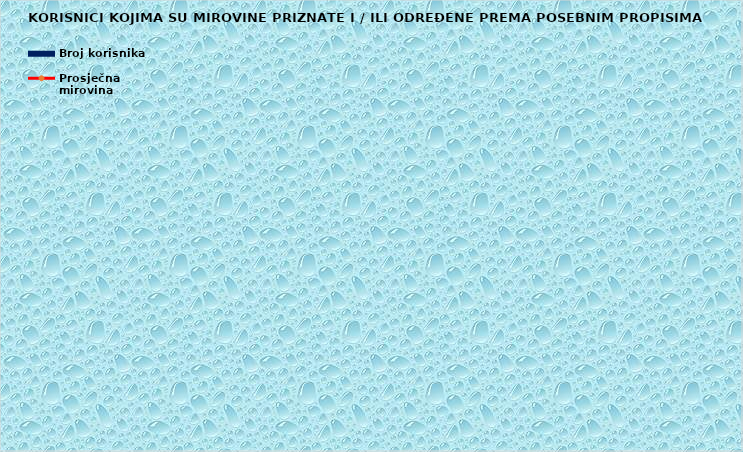
| Category | Broj korisnika |
|---|---|
|      a) radnici na poslovima ovlaštenih službenih osoba u tijelima unutarnjih 
poslova i pravosuđa, kojima je pravo na mirovinu priznato prema propisima
koji su bili na snazi do stupanja na snagu Zakona o pravima iz mirovinskog
osiguranja DVO, PS i OSO | 7925 |
|      b) radnici na  poslovima policijskih službenika, ovlaštenih službenih osoba pravosuđa i službene osobe s posebnim dužnostima i ovlastima u sigurnosno obavještajnom sustavu RH koji su pravo na mirovinu ostvarili prema Zakonu o pravima DVO, PS i OSO | 8921 |
|      c) radnici na poslovima razminiranja | 613 |
| Korisnici koji pravo na mirovinu ostvaruju prema Zakonu o vatrogastvu (NN 125/19)* | 156 |
| Djelatne vojne osobe - DVO  | 15892 |
| Pripadnici Hrvatske domovinske vojske od 1941. do 1945. godine | 2929 |
| Bivši politički zatvorenici | 2482 |
| Hrvatski branitelji iz Domovinskog rata - ZOHBDR | 70814 |
| Mirovine priznate prema općim propisima, a određene prema
ZOHBDR - u iz 2017. (čl. 27., 35., 48. i 49. stavak 2.)  | 49253 |
| Pripadnici bivše Jugoslavenske narodne armije - JNA | 4600 |
| Pripadnici bivše Jugoslavenske narodne armije - JNA - čl. 185 ZOMO | 159 |
| Sudionici Narodnooslobodilačkog rata - NOR | 7264 |
| Zastupnici u Hrvatskom saboru, članovi Vlade, suci Ustavnog suda i glavni državni revizor  | 688 |
| Članovi Izvršnog vijeća Sabora, Saveznog izvršnog vijeća i administrativno umirovljeni javni službenici | 77 |
| Bivši službenici u saveznim tijelima bivše SFRJ - članak 38. ZOMO | 29 |
| Redoviti članovi Hrvatske akademije znanosti i umjetnosti - HAZU | 133 |
| Radnici u Istarskim ugljenokopima "Tupljak" d.d. Labin  | 247 |
| Radnici profesionalno izloženi azbestu | 857 |
| Osiguranici - članovi posade broda u međunarodnoj plovidbi i nacionalnoj plovidbi - članak 129. a stavak 2. Pomorskog zakonika | 198 |
| Pripadnici Hrvatskog vijeća obrane  - HVO  | 6772 |